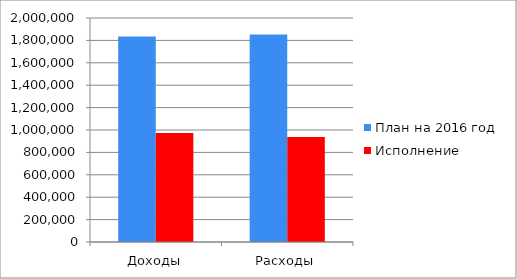
| Category | План на 2016 год | Исполнение |
|---|---|---|
| Доходы | 1834494 | 972416 |
| Расходы | 1851749.6 | 938526 |